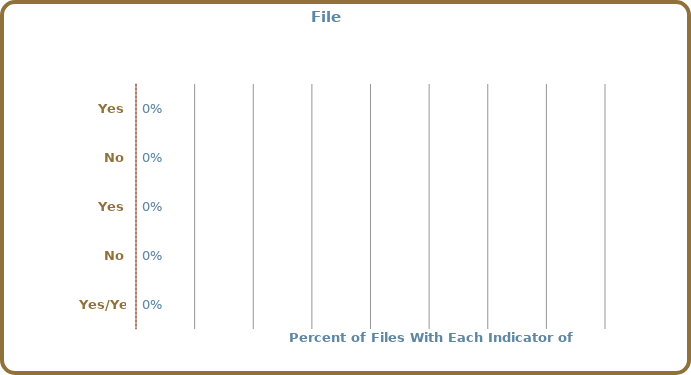
| Category | Each document has an entry |
|---|---|
| Yes | 0 |
| No | 0 |
| Yes | 0 |
| No | 0 |
| Yes/Yes | 0 |